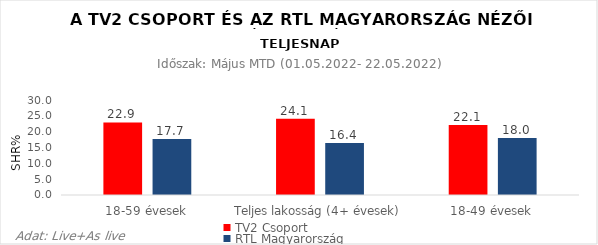
| Category | TV2 Csoport | RTL Magyarország |
|---|---|---|
| 18-59 évesek | 22.9 | 17.7 |
| Teljes lakosság (4+ évesek) | 24.1 | 16.4 |
| 18-49 évesek | 22.1 | 18 |